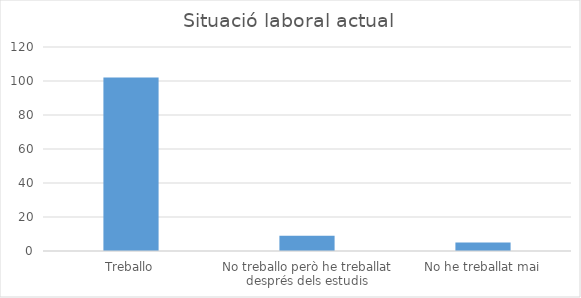
| Category | Series 0 |
|---|---|
| Treballo | 102 |
| No treballo però he treballat després dels estudis | 9 |
| No he treballat mai | 5 |